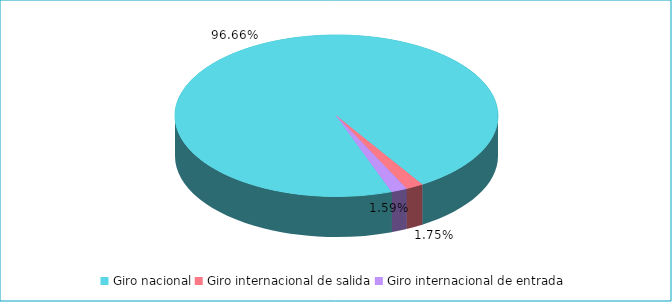
| Category | Series 0 |
|---|---|
| Giro nacional | 0.967 |
| Giro internacional de salida | 0.018 |
| Giro internacional de entrada | 0.016 |